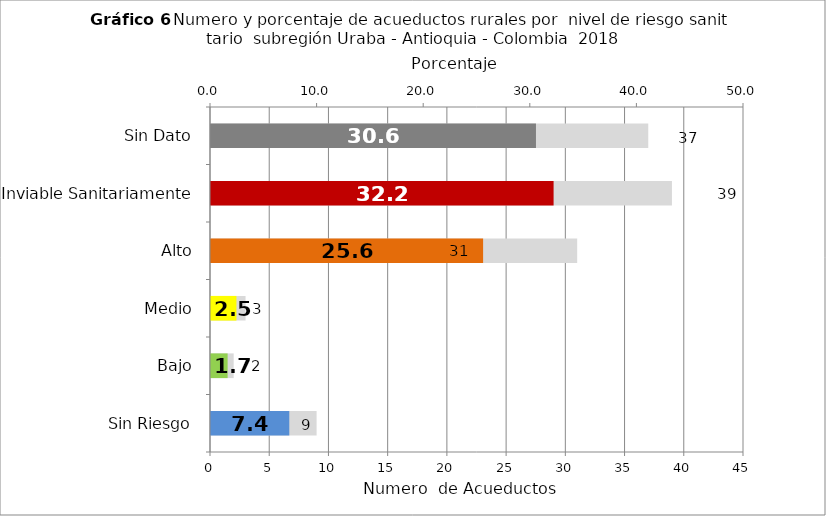
| Category | Número de Sistemas |
|---|---|
| Sin Riesgo | 9 |
| Bajo | 2 |
| Medio | 3 |
| Alto | 31 |
| Inviable Sanitariamente | 39 |
| Sin Dato | 37 |